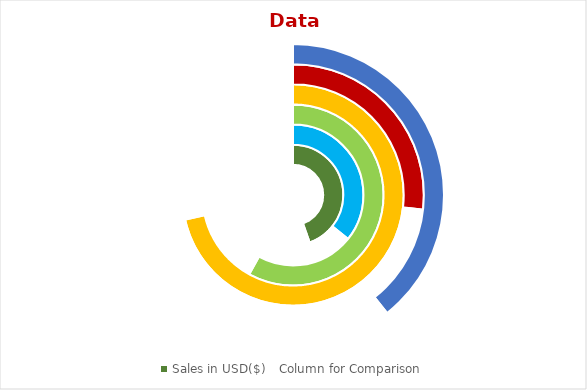
| Category | California | Florida | Texas | New York | Arizona | Washinton |
|---|---|---|---|---|---|---|
| Sales in USD($) | 2500000 | 2000000 | 3250000 | 4000000 | 1500000 | 2200000 |
| Column for Comparison | 3100000 | 3600000 | 2350000 | 1600000 | 4100000 | 3400000 |